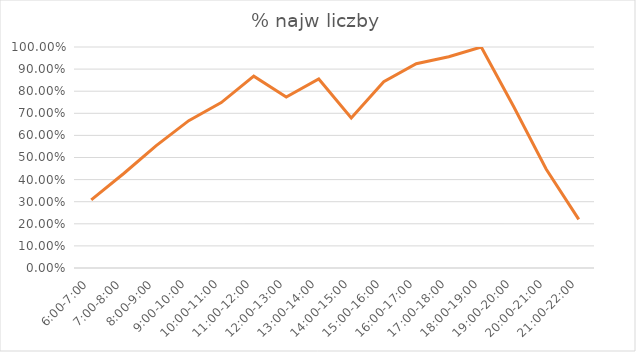
| Category | % najw liczby |
|---|---|
| 6:00-7:00 | 0.308 |
| 7:00-8:00 | 0.428 |
| 8:00-9:00 | 0.553 |
| 9:00-10:00 | 0.667 |
| 10:00-11:00 | 0.748 |
| 11:00-12:00 | 0.868 |
| 12:00-13:00 | 0.774 |
| 13:00-14:00 | 0.855 |
| 14:00-15:00 | 0.679 |
| 15:00-16:00 | 0.843 |
| 16:00-17:00 | 0.925 |
| 17:00-18:00 | 0.956 |
| 18:00-19:00 | 1 |
| 19:00-20:00 | 0.73 |
| 20:00-21:00 | 0.447 |
| 21:00-22:00 | 0.22 |